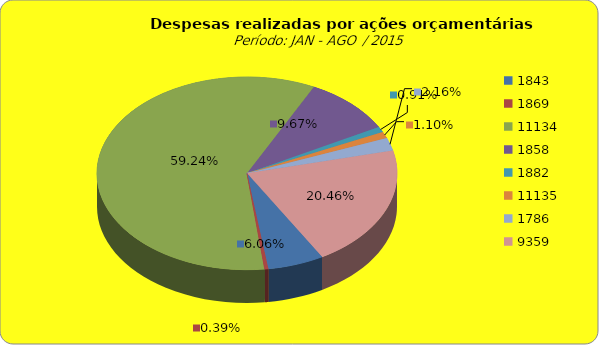
| Category | Series 1 |
|---|---|
| 1843.0 | 8197055.96 |
| 1869.0 | 528272.27 |
| 11134.0 | 80185840.77 |
| 1858.0 | 13093484.06 |
| 1882.0 | 1233712.51 |
| 11135.0 | 1493407.48 |
| 1786.0 | 2930240.61 |
| 9359.0 | 27693218.22 |